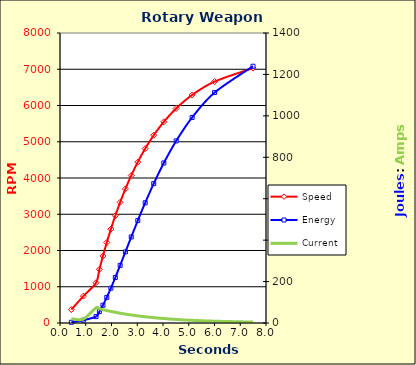
| Category | Speed |
|---|---|
| 0.44146958930700103 | 370 |
| 0.9068137293970286 | 740 |
| 1.3987630530787265 | 1110 |
| 1.5292085977388956 | 1480 |
| 1.6680756502517091 | 1850 |
| 1.816527095046449 | 2220 |
| 1.975984663631763 | 2590 |
| 2.14821195818156 | 2960 |
| 2.335433686300722 | 3330 |
| 2.5405118862749676 | 3700 |
| 2.767215318624225 | 4070 |
| 3.020648194204818 | 4440 |
| 3.3079666915123713 | 4810 |
| 3.639651554647482 | 5180 |
| 4.031951482740889 | 5550 |
| 4.512087790670741 | 5920 |
| 5.131091151113404 | 6290 |
| 6.003527387136663 | 6660 |
| 7.494966983602582 | 7030 |